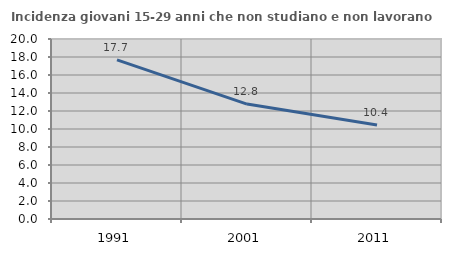
| Category | Incidenza giovani 15-29 anni che non studiano e non lavorano  |
|---|---|
| 1991.0 | 17.674 |
| 2001.0 | 12.769 |
| 2011.0 | 10.436 |